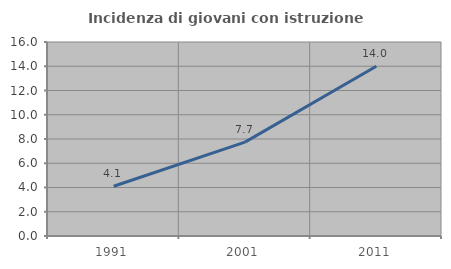
| Category | Incidenza di giovani con istruzione universitaria |
|---|---|
| 1991.0 | 4.101 |
| 2001.0 | 7.743 |
| 2011.0 | 14.004 |